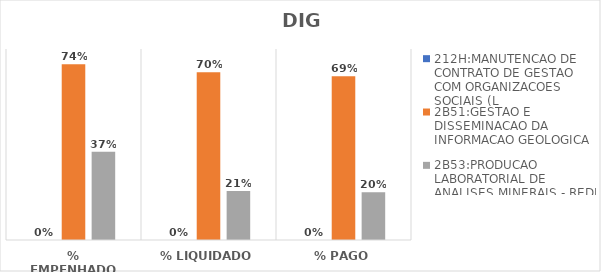
| Category | 212H:MANUTENCAO DE CONTRATO DE GESTAO COM ORGANIZACOES SOCIAIS (L | 2B51:GESTAO E DISSEMINACAO DA INFORMACAO GEOLOGICA | 2B53:PRODUCAO LABORATORIAL DE ANALISES MINERAIS - REDE LAMIN |
|---|---|---|---|
| % EMPENHADO | 0 | 0.736 | 0.37 |
| % LIQUIDADO | 0 | 0.702 | 0.205 |
| % PAGO | 0 | 0.686 | 0.2 |